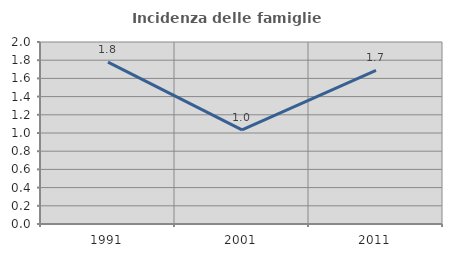
| Category | Incidenza delle famiglie numerose |
|---|---|
| 1991.0 | 1.779 |
| 2001.0 | 1.035 |
| 2011.0 | 1.688 |